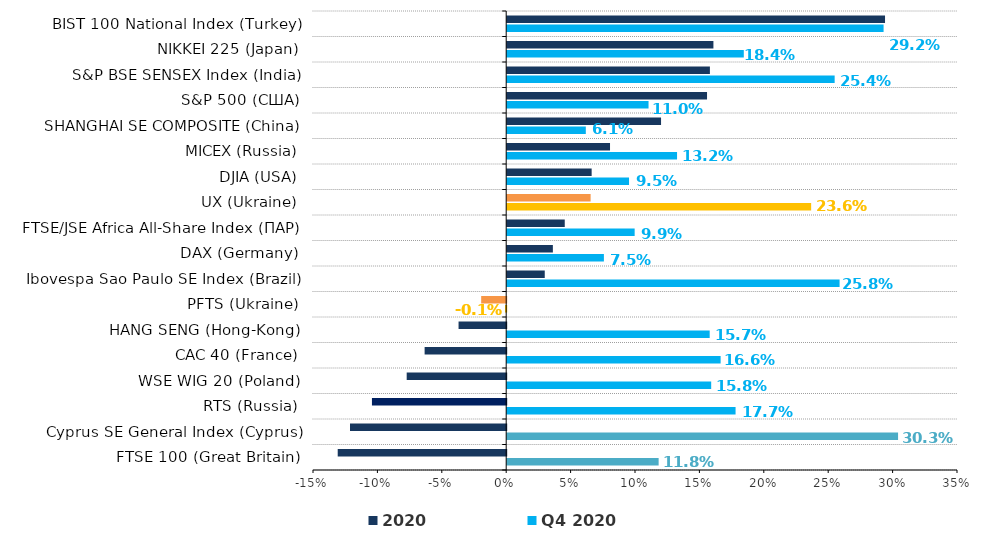
| Category | Q4 2020 | 2020 |
|---|---|---|
| FTSE 100 (Great Britain) | 0.118 | -0.131 |
| Cyprus SE General Index (Cyprus) | 0.303 | -0.121 |
| RTS (Russia) | 0.177 | -0.104 |
| WSE WIG 20 (Poland) | 0.158 | -0.077 |
| CAC 40 (France) | 0.166 | -0.063 |
| HANG SENG (Hong-Kong) | 0.157 | -0.037 |
| PFTS (Ukraine) | -0.001 | -0.019 |
| Ibovespa Sao Paulo SE Index (Brazil) | 0.258 | 0.029 |
| DAX (Germany) | 0.075 | 0.035 |
| FTSE/JSE Africa All-Share Index (ПАР) | 0.099 | 0.045 |
| UX (Ukraine) | 0.236 | 0.065 |
| DJIA (USA) | 0.095 | 0.066 |
| MICEX (Russia) | 0.132 | 0.08 |
| SHANGHAI SE COMPOSITE (China) | 0.061 | 0.119 |
| S&P 500 (США) | 0.11 | 0.155 |
| S&P BSE SENSEX Index (India) | 0.254 | 0.157 |
| NIKKEI 225 (Japan) | 0.184 | 0.16 |
| BIST 100 National Index (Тurkey) | 0.292 | 0.293 |